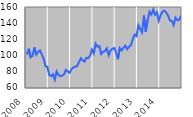
| Category | Series 0 |
|---|---|
| 2008.0 | 101.221 |
| 2.0 | 108.435 |
| 3.0 | 97.89 |
| 4.0 | 99.625 |
| 5.0 | 110.034 |
| 6.0 | 101.113 |
| 7.0 | 104.57 |
| 8.0 | 106.41 |
| 9.0 | 101.457 |
| 10.0 | 96.173 |
| 11.0 | 86.792 |
| 12.0 | 86.281 |
| 2009.0 | 76.032 |
| 2.0 | 74.608 |
| 3.0 | 77.104 |
| 4.0 | 70.252 |
| 5.0 | 80.467 |
| 6.0 | 76.096 |
| 7.0 | 74.488 |
| 8.0 | 75.317 |
| 9.0 | 76.868 |
| 10.0 | 82.312 |
| 11.0 | 80.404 |
| 12.0 | 78.89 |
| 2010.0 | 83.195 |
| 2.0 | 85.352 |
| 3.0 | 86.405 |
| 4.0 | 87.002 |
| 5.0 | 91.968 |
| 6.0 | 96.59 |
| 7.0 | 94.216 |
| 8.0 | 92.672 |
| 9.0 | 97.197 |
| 10.0 | 97.03 |
| 11.0 | 99.788 |
| 12.0 | 107.322 |
| 2011.0 | 102.689 |
| 2.0 | 114.811 |
| 3.0 | 110.988 |
| 4.0 | 111.845 |
| 5.0 | 101.787 |
| 6.0 | 104.671 |
| 7.0 | 105.628 |
| 8.0 | 108.957 |
| 9.0 | 100.386 |
| 10.0 | 106.264 |
| 11.0 | 108.407 |
| 12.0 | 109.264 |
| 2012.0 | 103.963 |
| 2.0 | 95.494 |
| 3.0 | 109.328 |
| 4.0 | 106.412 |
| 5.0 | 109.468 |
| 6.0 | 112.337 |
| 7.0 | 107.986 |
| 8.0 | 110.983 |
| 9.0 | 113.055 |
| 10.0 | 120.361 |
| 11.0 | 125.835 |
| 12.0 | 124.077 |
| 2013.0 | 137.608 |
| 2.0 | 133.037 |
| 3.0 | 128.681 |
| 4.0 | 149.385 |
| 5.0 | 129.423 |
| 6.0 | 143.837 |
| 7.0 | 154.084 |
| 8.0 | 150.541 |
| 9.0 | 156.869 |
| 10.0 | 150.568 |
| 11.0 | 153.674 |
| 12.0 | 143.139 |
| 2014.0 | 150.044 |
| 2.0 | 154.326 |
| 3.0 | 155.442 |
| 4.0 | 153.18 |
| 5.0 | 149.499 |
| 6.0 | 143.268 |
| 7.0 | 142.914 |
| 8.0 | 137.738 |
| 9.0 | 146.882 |
| 10.0 | 143.698 |
| 11.0 | 143.918 |
| 12.0 | 149.441 |